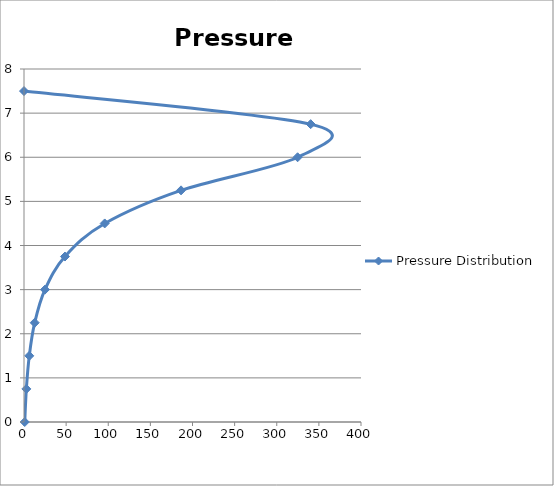
| Category | Pressure Distribution |
|---|---|
| 0.0 | 7.5 |
| 340.24845437829725 | 6.75 |
| 324.7425953657067 | 6 |
| 186.41322908268435 | 5.25 |
| 95.80364734089704 | 4.5 |
| 48.628253374184595 | 3.75 |
| 24.86931564438773 | 3 |
| 12.694957403780215 | 2.25 |
| 6.27535587855206 | 1.5 |
| 2.7988999907617185 | 0.75 |
| 0.8800698622259175 | 0 |